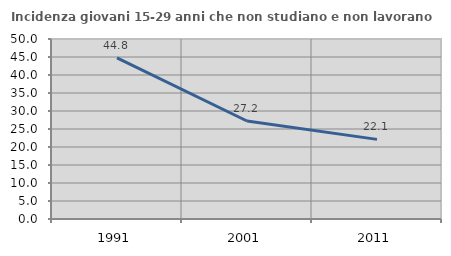
| Category | Incidenza giovani 15-29 anni che non studiano e non lavorano  |
|---|---|
| 1991.0 | 44.755 |
| 2001.0 | 27.228 |
| 2011.0 | 22.115 |